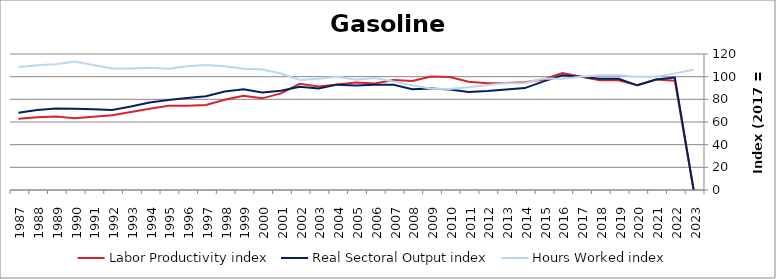
| Category | Labor Productivity index | Real Sectoral Output index | Hours Worked index |
|---|---|---|---|
| 2023.0 | 0 | 0 | 106.174 |
| 2022.0 | 96.418 | 99.21 | 102.896 |
| 2021.0 | 97.484 | 97.523 | 100.04 |
| 2020.0 | 92.425 | 92.364 | 99.933 |
| 2019.0 | 96.897 | 98.093 | 101.235 |
| 2018.0 | 96.81 | 98.068 | 101.3 |
| 2017.0 | 100 | 100 | 100 |
| 2016.0 | 103.144 | 101.311 | 98.222 |
| 2015.0 | 97.514 | 95.888 | 98.333 |
| 2014.0 | 95.124 | 89.907 | 94.516 |
| 2013.0 | 94.311 | 88.749 | 94.102 |
| 2012.0 | 94.17 | 87.337 | 92.744 |
| 2011.0 | 95.445 | 86.475 | 90.601 |
| 2010.0 | 99.693 | 88.74 | 89.013 |
| 2009.0 | 100.229 | 89.612 | 89.407 |
| 2008.0 | 96.167 | 88.862 | 92.403 |
| 2007.0 | 97.075 | 92.848 | 95.645 |
| 2006.0 | 94.041 | 92.925 | 98.813 |
| 2005.0 | 94.78 | 92.128 | 97.202 |
| 2004.0 | 93.049 | 92.962 | 99.906 |
| 2003.0 | 91.371 | 89.668 | 98.136 |
| 2002.0 | 93.746 | 91.01 | 97.081 |
| 2001.0 | 85.26 | 87.675 | 102.832 |
| 2000.0 | 80.869 | 86.03 | 106.383 |
| 1999.0 | 83.153 | 88.909 | 106.923 |
| 1998.0 | 79.591 | 86.957 | 109.256 |
| 1997.0 | 75.047 | 82.789 | 110.316 |
| 1996.0 | 74.306 | 81.098 | 109.14 |
| 1995.0 | 74.367 | 79.506 | 106.911 |
| 1994.0 | 71.668 | 77.294 | 107.85 |
| 1993.0 | 68.738 | 73.664 | 107.166 |
| 1992.0 | 65.906 | 70.689 | 107.258 |
| 1991.0 | 64.552 | 71.209 | 110.313 |
| 1990.0 | 63.301 | 71.728 | 113.313 |
| 1989.0 | 64.77 | 71.807 | 110.864 |
| 1988.0 | 64.09 | 70.512 | 110.021 |
| 1987.0 | 62.797 | 68.084 | 108.419 |